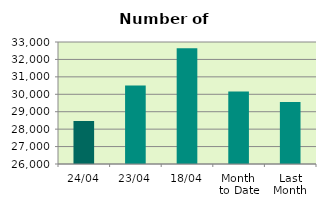
| Category | Series 0 |
|---|---|
| 24/04 | 28472 |
| 23/04 | 30508 |
| 18/04 | 32648 |
| Month 
to Date | 30160.125 |
| Last
Month | 29553.143 |